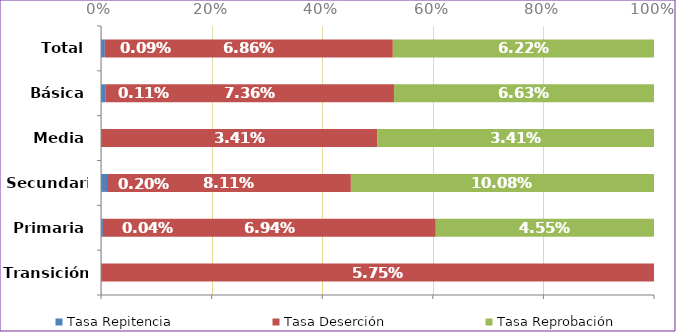
| Category | Tasa Repitencia | Tasa Deserción | Tasa Reprobación |
|---|---|---|---|
| Transición | 0 | 0.058 | 0 |
| Primaria | 0 | 0.069 | 0.046 |
| Secundaria | 0.002 | 0.081 | 0.101 |
| Media | 0 | 0.034 | 0.034 |
| Básica | 0.001 | 0.074 | 0.066 |
| Total | 0.001 | 0.069 | 0.062 |